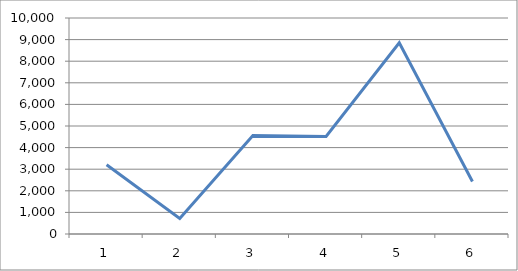
| Category | Series 0 |
|---|---|
| 1.0 | 3205 |
| 2.0 | 722 |
| 3.0 | 4555 |
| 4.0 | 4513.333 |
| 5.0 | 8852 |
| 6.0 | 2431 |